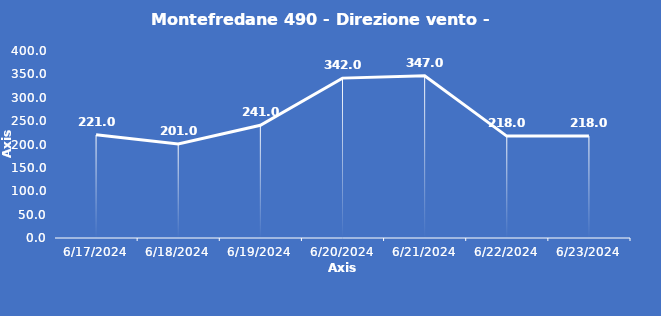
| Category | Montefredane 490 - Direzione vento - Grezzo (°N) |
|---|---|
| 6/17/24 | 221 |
| 6/18/24 | 201 |
| 6/19/24 | 241 |
| 6/20/24 | 342 |
| 6/21/24 | 347 |
| 6/22/24 | 218 |
| 6/23/24 | 218 |